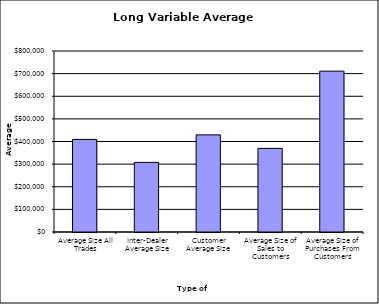
| Category | Security Type |
|---|---|
| Average Size All Trades | 409041.636 |
| Inter-Dealer Average Size | 307627.372 |
| Customer Average Size | 429290.111 |
| Average Size of Sales to Customers | 369429.046 |
| Average Size of Purchases From Customers | 710996.048 |